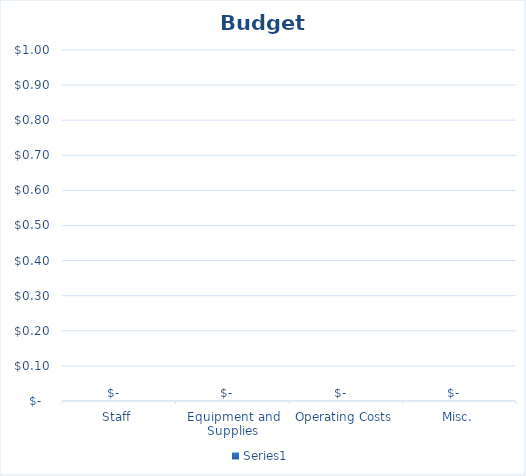
| Category | Series 0 |
|---|---|
| Staff | 0 |
| Equipment and Supplies | 0 |
| Operating Costs | 0 |
| Misc. | 0 |